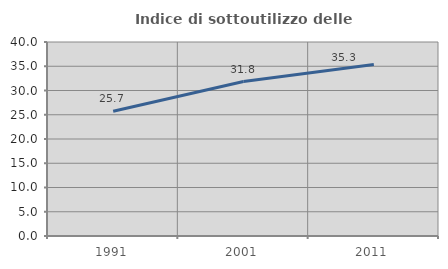
| Category | Indice di sottoutilizzo delle abitazioni  |
|---|---|
| 1991.0 | 25.72 |
| 2001.0 | 31.844 |
| 2011.0 | 35.342 |